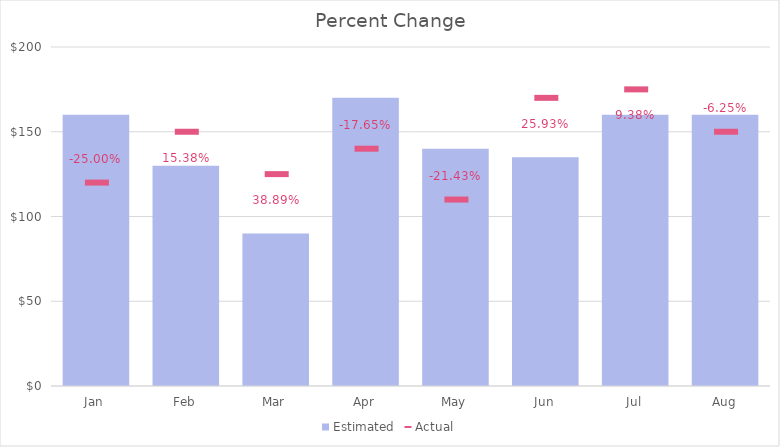
| Category | Estimated |
|---|---|
| Jan | 160 |
| Feb | 130 |
| Mar | 90 |
| Apr | 170 |
| May | 140 |
| Jun | 135 |
| Jul | 160 |
| Aug | 160 |